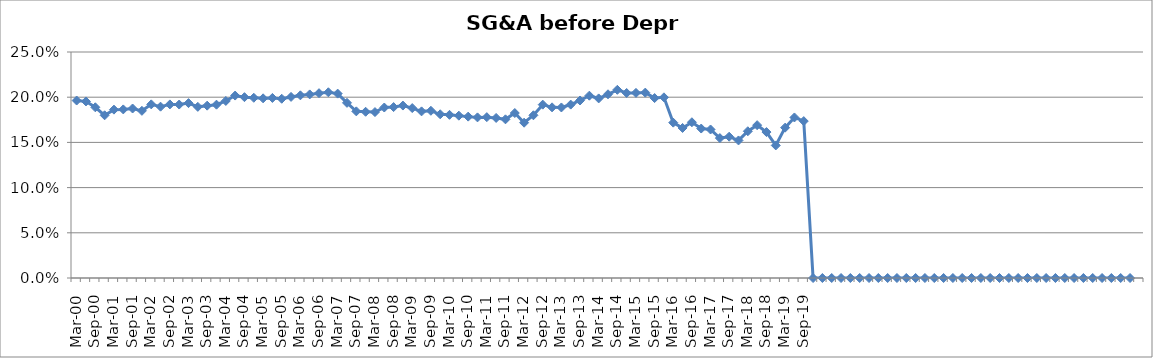
| Category | SG&A (before depr.) % |
|---|---|
| Mar-00 | 0.196 |
| Jun-00 | 0.195 |
| Sep-00 | 0.189 |
| Dec-00 | 0.18 |
| Mar-01 | 0.186 |
| Jun-01 | 0.186 |
| Sep-01 | 0.187 |
| Dec-01 | 0.185 |
| Mar-02 | 0.192 |
| Jun-02 | 0.19 |
| Sep-02 | 0.192 |
| Dec-02 | 0.192 |
| Mar-03 | 0.193 |
| Jun-03 | 0.189 |
| Sep-03 | 0.191 |
| Dec-03 | 0.192 |
| Mar-04 | 0.196 |
| Jun-04 | 0.202 |
| Sep-04 | 0.2 |
| Dec-04 | 0.199 |
| Mar-05 | 0.199 |
| Jun-05 | 0.199 |
| Sep-05 | 0.198 |
| Dec-05 | 0.2 |
| Mar-06 | 0.202 |
| Jun-06 | 0.203 |
| Sep-06 | 0.204 |
| Dec-06 | 0.205 |
| Mar-07 | 0.204 |
| Jun-07 | 0.194 |
| Sep-07 | 0.184 |
| Dec-07 | 0.184 |
| Mar-08 | 0.184 |
| Jun-08 | 0.189 |
| Sep-08 | 0.189 |
| Dec-08 | 0.191 |
| Mar-09 | 0.188 |
| Jun-09 | 0.184 |
| Sep-09 | 0.185 |
| Dec-09 | 0.181 |
| Mar-10 | 0.18 |
| Jun-10 | 0.18 |
| Sep-10 | 0.179 |
| Dec-10 | 0.178 |
| Mar-11 | 0.178 |
| Jun-11 | 0.177 |
| Sep-11 | 0.176 |
| Dec-11 | 0.182 |
| Mar-12 | 0.172 |
| Jun-12 | 0.18 |
| Sep-12 | 0.192 |
| Dec-12 | 0.189 |
| Mar-13 | 0.189 |
| Jun-13 | 0.192 |
| Sep-13 | 0.196 |
| Dec-13 | 0.202 |
| Mar-14 | 0.199 |
| Jun-14 | 0.203 |
| Sep-14 | 0.208 |
| Dec-14 | 0.205 |
| Mar-15 | 0.205 |
| Jun-15 | 0.205 |
| Sep-15 | 0.199 |
| Dec-15 | 0.2 |
| Mar-16 | 0.172 |
| Jun-16 | 0.166 |
| Sep-16 | 0.172 |
| Dec-16 | 0.165 |
| Mar-17 | 0.164 |
| Jun-17 | 0.155 |
| Sep-17 | 0.156 |
| Dec-17 | 0.152 |
| Mar-18 | 0.162 |
| Jun-18 | 0.169 |
| Sep-18 | 0.161 |
| Dec-18 | 0.147 |
| Mar-19 | 0.166 |
| Jun-19 | 0.178 |
| Sep-19 | 0.174 |